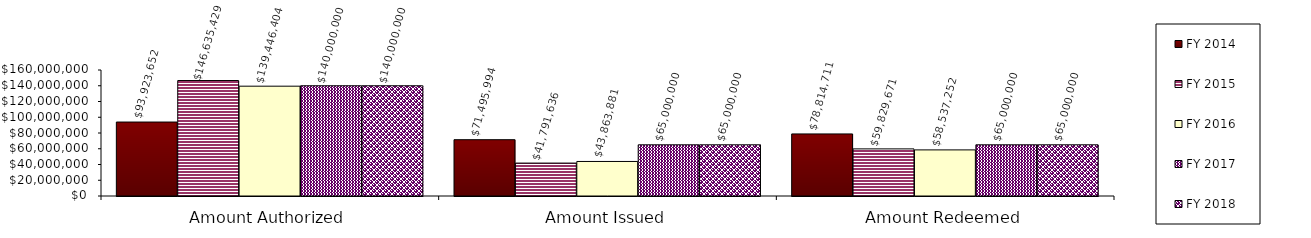
| Category | FY 2014 | FY 2015 | FY 2016 | FY 2017 | FY 2018 |
|---|---|---|---|---|---|
| Amount Authorized | 93923652 | 146635429 | 139446404 | 140000000 | 140000000 |
| Amount Issued | 71495994 | 41791636 | 43863881 | 65000000 | 65000000 |
| Amount Redeemed | 78814711 | 59829671 | 58537252 | 65000000 | 65000000 |